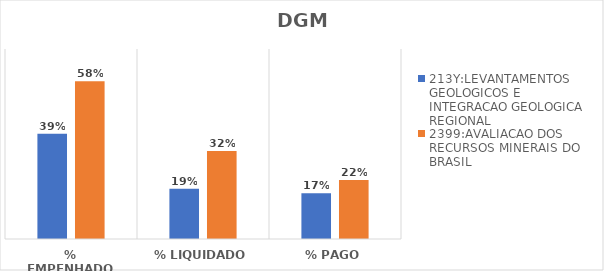
| Category | 213Y:LEVANTAMENTOS GEOLOGICOS E INTEGRACAO GEOLOGICA REGIONAL | 2399:AVALIACAO DOS RECURSOS MINERAIS DO BRASIL |
|---|---|---|
| % EMPENHADO | 0.388 | 0.581 |
| % LIQUIDADO | 0.185 | 0.324 |
| % PAGO | 0.168 | 0.217 |